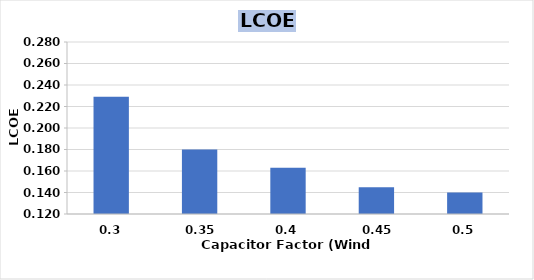
| Category | Wind Turbine |
|---|---|
| 0.3 | 0.229 |
| 0.35 | 0.18 |
| 0.4 | 0.163 |
| 0.45 | 0.145 |
| 0.5 | 0.14 |